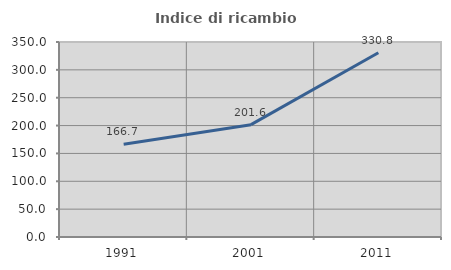
| Category | Indice di ricambio occupazionale  |
|---|---|
| 1991.0 | 166.667 |
| 2001.0 | 201.6 |
| 2011.0 | 330.769 |